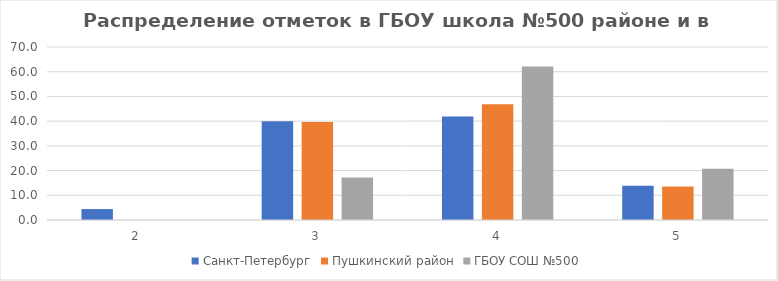
| Category | Санкт-Петербург | Пушкинский район | ГБОУ СОШ №500 |
|---|---|---|---|
| 2.0 | 4.42 | 0 | 0 |
| 3.0 | 39.92 | 39.64 | 17.24 |
| 4.0 | 41.85 | 46.85 | 62.07 |
| 5.0 | 13.81 | 13.51 | 20.69 |